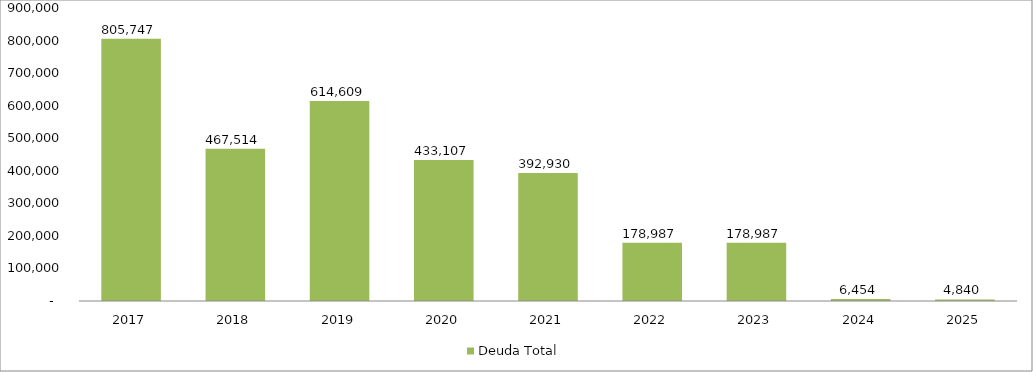
| Category | Deuda Total |
|---|---|
| 2017 | 805747.489 |
| 2018 | 467513.878 |
| 2019 | 614608.939 |
| 2020 | 433106.913 |
| 2021 | 392930.496 |
| 2022 | 178987.17 |
| 2023 | 178987.17 |
| 2024 | 6453.836 |
| 2025 | 4840.377 |